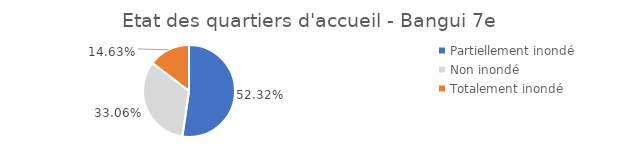
| Category | Individus PDI |
|---|---|
| Partiellement inondé | 0.523 |
| Non inondé | 0.331 |
| Totalement inondé | 0.146 |